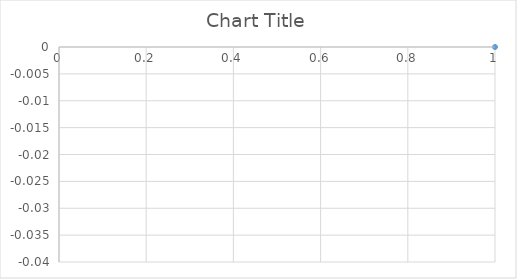
| Category | Series 0 |
|---|---|
| 0 | 0 |
| 1 | -0.001 |
| 2 | -0.005 |
| 3 | -0.012 |
| 4 | -0.022 |
| 5 | -0.034 |